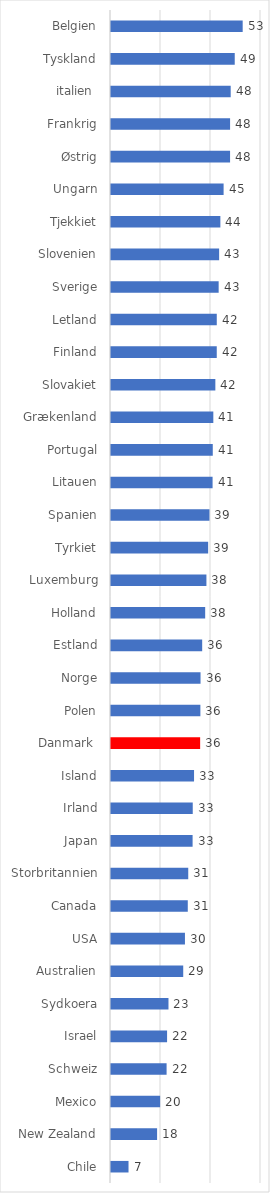
| Category | Series 0 |
|---|---|
| Chile | 7.008 |
| New Zealand | 18.436 |
| Mexico | 19.654 |
| Schweiz | 22.239 |
| Israel | 22.431 |
| Sydkoera | 22.993 |
| Australien | 28.889 |
| USA | 29.581 |
| Canada | 30.712 |
| Storbritannien | 30.897 |
| Japan | 32.64 |
| Irland | 32.7 |
| Island | 33.22 |
| Danmark  | 35.659 |
| Polen | 35.751 |
| Norge | 35.815 |
| Estland | 36.475 |
| Holland | 37.673 |
| Luxemburg | 38.166 |
| Tyrkiet | 38.865 |
| Spanien | 39.384 |
| Litauen | 40.634 |
| Portugal | 40.711 |
| Grækenland | 40.93 |
| Slovakiet | 41.741 |
| Finland | 42.303 |
| Letland | 42.31 |
| Sverige | 43.063 |
| Slovenien | 43.251 |
| Tjekkiet | 43.746 |
| Ungarn | 45.041 |
| Østrig | 47.629 |
| Frankrig | 47.633 |
| italien  | 47.877 |
| Tyskland | 49.496 |
| Belgien | 52.672 |